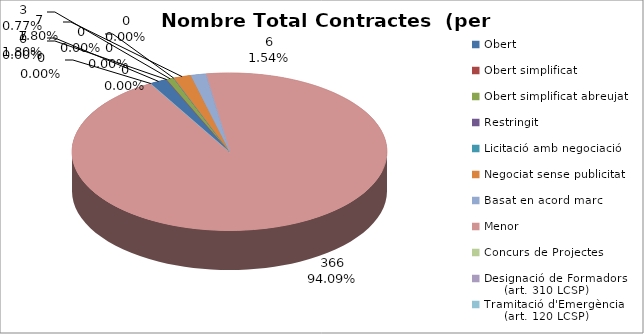
| Category | Nombre Total Contractes |
|---|---|
| Obert | 7 |
| Obert simplificat | 0 |
| Obert simplificat abreujat | 3 |
| Restringit | 0 |
| Licitació amb negociació | 0 |
| Negociat sense publicitat | 7 |
| Basat en acord marc | 6 |
| Menor | 366 |
| Concurs de Projectes | 0 |
| Designació de Formadors
     (art. 310 LCSP) | 0 |
| Tramitació d'Emergència
     (art. 120 LCSP) | 0 |